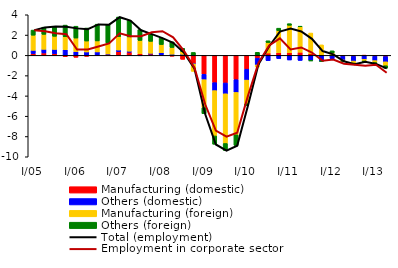
| Category | Manufacturing (domestic) | Others (domestic) | Manufacturing (foreign) | Others (foreign) |
|---|---|---|---|---|
| I/05 | 0.181 | 0.314 | 1.492 | 0.504 |
| II | 0.235 | 0.359 | 1.478 | 0.707 |
| III | 0.159 | 0.425 | 1.295 | 0.984 |
| IV | -0.13 | 0.552 | 1.281 | 1.149 |
| I/06 | -0.192 | 0.373 | 1.332 | 1.168 |
| II | -0.1 | 0.336 | 1.076 | 1.281 |
| III | 0.021 | 0.318 | 1.083 | 1.653 |
| IV | 0.102 | 0.034 | 1.078 | 1.832 |
| I/07 | 0.368 | 0.157 | 1.329 | 1.927 |
| II | 0.309 | 0.101 | 1.408 | 1.63 |
| III | 0.172 | -0.044 | 1.298 | 1.068 |
| IV | 0.129 | 0.071 | 1.181 | 0.73 |
| I/08 | 0.046 | 0.209 | 0.811 | 0.656 |
| II | -0.084 | 0.116 | 0.658 | 0.562 |
| III | -0.393 | 0.104 | 0.264 | 0.325 |
| IV | -0.813 | -0.022 | -0.743 | 0.287 |
| I/09 | -1.865 | -0.532 | -2.764 | -0.597 |
| II | -2.691 | -0.787 | -4.47 | -0.818 |
| III | -2.722 | -1.065 | -4.901 | -0.686 |
| IV | -2.395 | -1.261 | -4.174 | -1.053 |
| I/10 | -1.364 | -1.074 | -2.335 | -0.196 |
| II | -0.276 | -0.665 | -0.203 | 0.3 |
| III | 0.233 | -0.523 | 1.033 | 0.174 |
| IV | 0.251 | -0.318 | 2.181 | 0.247 |
| I/11 | 0.254 | -0.456 | 2.712 | 0.159 |
| II | 0.304 | -0.5 | 2.511 | 0.062 |
| III | 0.165 | -0.489 | 2.035 | -0.065 |
| IV | 0.072 | -0.564 | 0.962 | -0.024 |
| I/12 | -0.008 | -0.319 | 0.244 | 0.204 |
| II | -0.082 | -0.368 | -0.106 | -0.012 |
| III | -0.091 | -0.47 | -0.198 | -0.084 |
| IV | -0.024 | -0.362 | -0.184 | -0.045 |
| I/13 | -0.08 | -0.438 | -0.193 | -0.112 |
| II | -0.116 | -0.522 | -0.383 | -0.245 |